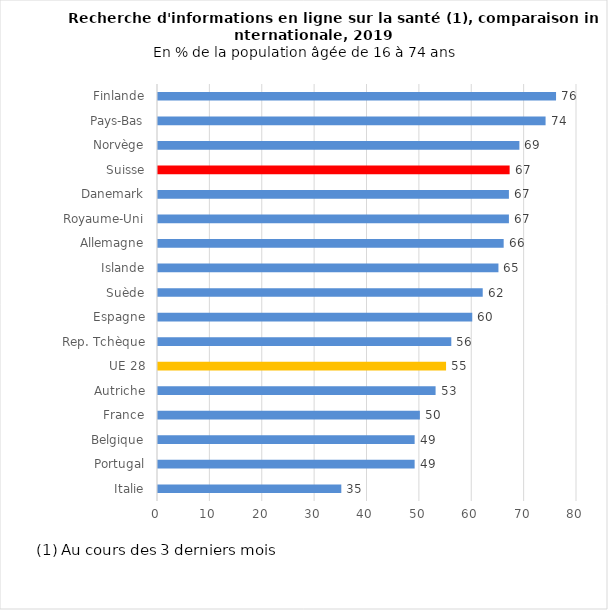
| Category | 2019 |
|---|---|
| Italie | 35 |
| Portugal | 49 |
| Belgique | 49 |
| France | 50 |
| Autriche | 53 |
| UE 28 | 55 |
| Rep. Tchèque | 56 |
| Espagne | 60 |
| Suède | 62 |
| Islande | 65 |
| Allemagne | 66 |
| Royaume-Uni | 67 |
| Danemark | 67 |
| Suisse | 67.138 |
| Norvège | 69 |
| Pays-Bas | 74 |
| Finlande | 76 |